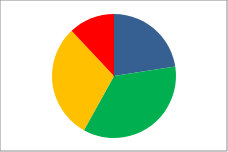
| Category | Series 0 | Series 1 |
|---|---|---|
| Outstanding | 49 | 0.226 |
| Good | 77 | 0.355 |
| RI | 65 | 0.3 |
| Inadequate | 26 | 0.12 |